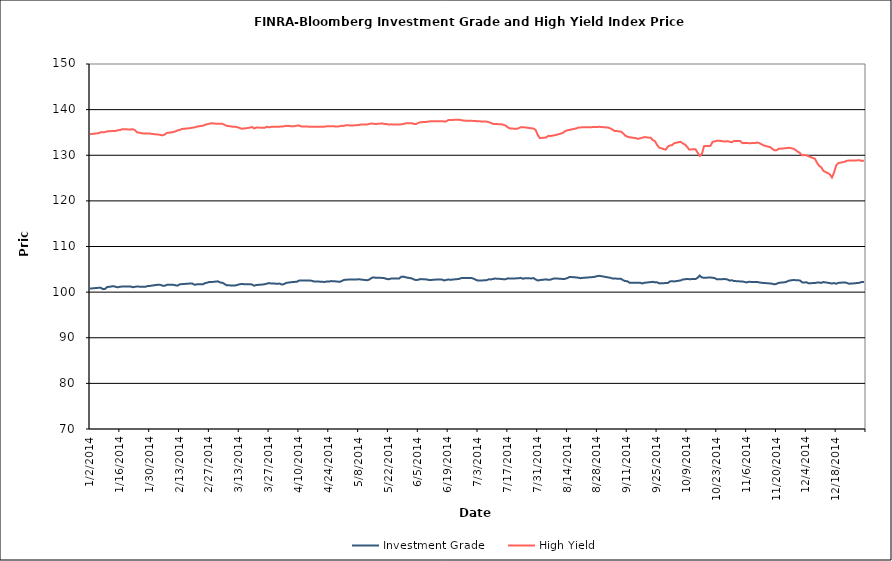
| Category | Investment Grade | High Yield |
|---|---|---|
| 1/2/14 | 100.818 | 134.61 |
| 1/3/14 | 100.821 | 134.675 |
| 1/6/14 | 100.947 | 134.841 |
| 1/7/14 | 100.979 | 135.053 |
| 1/8/14 | 100.662 | 135.04 |
| 1/9/14 | 100.703 | 135.072 |
| 1/10/14 | 101.104 | 135.228 |
| 1/13/14 | 101.302 | 135.332 |
| 1/14/14 | 101.168 | 135.33 |
| 1/15/14 | 101.05 | 135.493 |
| 1/16/14 | 101.186 | 135.513 |
| 1/17/14 | 101.214 | 135.694 |
| 1/21/14 | 101.237 | 135.657 |
| 1/22/14 | 101.077 | 135.696 |
| 1/23/14 | 101.165 | 135.526 |
| 1/24/14 | 101.225 | 135.025 |
| 1/27/14 | 101.165 | 134.766 |
| 1/28/14 | 101.185 | 134.798 |
| 1/29/14 | 101.336 | 134.736 |
| 1/30/14 | 101.366 | 134.782 |
| 1/31/14 | 101.431 | 134.664 |
| 2/3/14 | 101.636 | 134.541 |
| 2/4/14 | 101.583 | 134.457 |
| 2/5/14 | 101.42 | 134.361 |
| 2/6/14 | 101.393 | 134.536 |
| 2/7/14 | 101.592 | 134.888 |
| 2/10/14 | 101.615 | 135.076 |
| 2/11/14 | 101.498 | 135.216 |
| 2/12/14 | 101.418 | 135.441 |
| 2/13/14 | 101.69 | 135.543 |
| 2/14/14 | 101.753 | 135.746 |
| 2/18/14 | 101.892 | 135.952 |
| 2/19/14 | 101.879 | 136.044 |
| 2/20/14 | 101.613 | 136.097 |
| 2/21/14 | 101.699 | 136.258 |
| 2/24/14 | 101.732 | 136.482 |
| 2/25/14 | 101.989 | 136.691 |
| 2/26/14 | 102.079 | 136.809 |
| 2/27/14 | 102.222 | 136.918 |
| 2/28/14 | 102.211 | 137.009 |
| 3/3/14 | 102.364 | 136.884 |
| 3/4/14 | 102.118 | 136.915 |
| 3/5/14 | 102.048 | 136.916 |
| 3/6/14 | 101.816 | 136.684 |
| 3/7/14 | 101.497 | 136.459 |
| 3/10/14 | 101.461 | 136.253 |
| 3/11/14 | 101.46 | 136.252 |
| 3/12/14 | 101.557 | 136.142 |
| 3/13/14 | 101.718 | 136.026 |
| 3/14/14 | 101.769 | 135.809 |
| 3/17/14 | 101.717 | 135.965 |
| 3/18/14 | 101.749 | 136.072 |
| 3/19/14 | 101.649 | 136.191 |
| 3/20/14 | 101.412 | 135.875 |
| 3/21/14 | 101.566 | 136.086 |
| 3/24/14 | 101.667 | 136.015 |
| 3/25/14 | 101.737 | 136.04 |
| 3/26/14 | 101.878 | 136.252 |
| 3/27/14 | 101.987 | 136.119 |
| 3/28/14 | 101.878 | 136.233 |
| 3/31/14 | 101.852 | 136.266 |
| 4/1/14 | 101.868 | 136.261 |
| 4/2/14 | 101.643 | 136.321 |
| 4/3/14 | 101.764 | 136.337 |
| 4/4/14 | 102.025 | 136.448 |
| 4/7/14 | 102.21 | 136.349 |
| 4/8/14 | 102.242 | 136.393 |
| 4/9/14 | 102.266 | 136.486 |
| 4/10/14 | 102.532 | 136.521 |
| 4/11/14 | 102.573 | 136.311 |
| 4/14/14 | 102.531 | 136.308 |
| 4/15/14 | 102.544 | 136.227 |
| 4/16/14 | 102.487 | 136.253 |
| 4/17/14 | 102.346 | 136.257 |
| 4/21/14 | 102.277 | 136.247 |
| 4/22/14 | 102.207 | 136.279 |
| 4/23/14 | 102.343 | 136.332 |
| 4/24/14 | 102.303 | 136.334 |
| 4/25/14 | 102.421 | 136.355 |
| 4/28/14 | 102.328 | 136.308 |
| 4/29/14 | 102.243 | 136.341 |
| 4/30/14 | 102.413 | 136.464 |
| 5/1/14 | 102.654 | 136.42 |
| 5/2/14 | 102.735 | 136.585 |
| 5/5/14 | 102.752 | 136.518 |
| 5/6/14 | 102.75 | 136.554 |
| 5/7/14 | 102.757 | 136.59 |
| 5/8/14 | 102.825 | 136.629 |
| 5/9/14 | 102.765 | 136.738 |
| 5/12/14 | 102.608 | 136.757 |
| 5/13/14 | 102.76 | 136.86 |
| 5/14/14 | 103.095 | 136.951 |
| 5/15/14 | 103.233 | 136.892 |
| 5/16/14 | 103.154 | 136.848 |
| 5/19/14 | 103.118 | 136.968 |
| 5/20/14 | 103.068 | 136.874 |
| 5/21/14 | 102.909 | 136.849 |
| 5/22/14 | 102.817 | 136.739 |
| 5/23/14 | 102.956 | 136.771 |
| 5/27/14 | 102.996 | 136.726 |
| 5/28/14 | 103.368 | 136.78 |
| 5/29/14 | 103.4 | 136.844 |
| 5/30/14 | 103.25 | 136.989 |
| 6/2/14 | 102.997 | 137.03 |
| 6/3/14 | 102.747 | 136.843 |
| 6/4/14 | 102.639 | 136.861 |
| 6/5/14 | 102.724 | 137.095 |
| 6/6/14 | 102.858 | 137.239 |
| 6/9/14 | 102.774 | 137.321 |
| 6/10/14 | 102.652 | 137.409 |
| 6/11/14 | 102.666 | 137.46 |
| 6/12/14 | 102.706 | 137.448 |
| 6/13/14 | 102.744 | 137.427 |
| 6/16/14 | 102.763 | 137.473 |
| 6/17/14 | 102.566 | 137.403 |
| 6/18/14 | 102.647 | 137.424 |
| 6/19/14 | 102.775 | 137.698 |
| 6/20/14 | 102.697 | 137.723 |
| 6/23/14 | 102.846 | 137.779 |
| 6/24/14 | 102.88 | 137.797 |
| 6/25/14 | 103.059 | 137.699 |
| 6/26/14 | 103.117 | 137.613 |
| 6/27/14 | 103.111 | 137.582 |
| 6/30/14 | 103.096 | 137.543 |
| 7/1/14 | 102.92 | 137.521 |
| 7/2/14 | 102.692 | 137.487 |
| 7/3/14 | 102.53 | 137.445 |
| 7/7/14 | 102.607 | 137.369 |
| 7/8/14 | 102.82 | 137.259 |
| 7/9/14 | 102.778 | 137.102 |
| 7/10/14 | 102.892 | 136.873 |
| 7/11/14 | 102.97 | 136.858 |
| 7/14/14 | 102.883 | 136.783 |
| 7/15/14 | 102.808 | 136.662 |
| 7/16/14 | 102.837 | 136.489 |
| 7/17/14 | 103.023 | 136.093 |
| 7/18/14 | 102.976 | 135.884 |
| 7/21/14 | 103.018 | 135.786 |
| 7/22/14 | 103.027 | 135.911 |
| 7/23/14 | 103.133 | 136.146 |
| 7/24/14 | 102.926 | 136.135 |
| 7/25/14 | 103.053 | 136.103 |
| 7/28/14 | 103.005 | 135.916 |
| 7/29/14 | 103.084 | 135.842 |
| 7/30/14 | 102.775 | 135.555 |
| 7/31/14 | 102.536 | 134.442 |
| 8/1/14 | 102.65 | 133.751 |
| 8/4/14 | 102.794 | 133.906 |
| 8/5/14 | 102.693 | 134.262 |
| 8/6/14 | 102.743 | 134.202 |
| 8/7/14 | 102.903 | 134.308 |
| 8/8/14 | 103.015 | 134.39 |
| 8/11/14 | 102.911 | 134.76 |
| 8/12/14 | 102.848 | 134.962 |
| 8/13/14 | 102.947 | 135.352 |
| 8/14/14 | 103.093 | 135.465 |
| 8/15/14 | 103.336 | 135.579 |
| 8/18/14 | 103.224 | 135.868 |
| 8/19/14 | 103.166 | 136.06 |
| 8/20/14 | 103.049 | 136.102 |
| 8/21/14 | 103.116 | 136.129 |
| 8/22/14 | 103.16 | 136.109 |
| 8/25/14 | 103.266 | 136.118 |
| 8/26/14 | 103.305 | 136.212 |
| 8/27/14 | 103.386 | 136.164 |
| 8/28/14 | 103.533 | 136.214 |
| 8/29/14 | 103.569 | 136.23 |
| 9/2/14 | 103.224 | 136.057 |
| 9/3/14 | 103.152 | 135.89 |
| 9/4/14 | 102.992 | 135.641 |
| 9/5/14 | 102.979 | 135.338 |
| 9/8/14 | 102.91 | 135.188 |
| 9/9/14 | 102.636 | 134.826 |
| 9/10/14 | 102.415 | 134.318 |
| 9/11/14 | 102.404 | 134.077 |
| 9/12/14 | 102.066 | 133.947 |
| 9/15/14 | 102.058 | 133.746 |
| 9/16/14 | 102.079 | 133.58 |
| 9/17/14 | 102.06 | 133.729 |
| 9/18/14 | 101.895 | 133.842 |
| 9/19/14 | 102.051 | 133.984 |
| 9/22/14 | 102.194 | 133.817 |
| 9/23/14 | 102.265 | 133.321 |
| 9/24/14 | 102.135 | 133.064 |
| 9/25/14 | 102.162 | 132.238 |
| 9/26/14 | 101.911 | 131.656 |
| 9/29/14 | 101.987 | 131.223 |
| 9/30/14 | 101.995 | 131.89 |
| 10/1/14 | 102.349 | 132.149 |
| 10/2/14 | 102.373 | 132.201 |
| 10/3/14 | 102.345 | 132.64 |
| 10/6/14 | 102.56 | 132.946 |
| 10/7/14 | 102.76 | 132.603 |
| 10/8/14 | 102.816 | 132.383 |
| 10/9/14 | 102.873 | 131.878 |
| 10/10/14 | 102.843 | 131.266 |
| 10/13/14 | 102.861 | 131.314 |
| 10/14/14 | 103.153 | 130.54 |
| 10/15/14 | 103.63 | 129.86 |
| 10/16/14 | 103.21 | 130.301 |
| 10/17/14 | 103.149 | 132.001 |
| 10/20/14 | 103.206 | 132.057 |
| 10/21/14 | 103.156 | 132.922 |
| 10/22/14 | 103.063 | 133.044 |
| 10/23/14 | 102.823 | 133.165 |
| 10/24/14 | 102.843 | 133.183 |
| 10/27/14 | 102.852 | 132.995 |
| 10/28/14 | 102.764 | 133.102 |
| 10/29/14 | 102.545 | 132.948 |
| 10/30/14 | 102.596 | 132.859 |
| 10/31/14 | 102.445 | 133.107 |
| 11/3/14 | 102.344 | 133.133 |
| 11/4/14 | 102.35 | 132.642 |
| 11/5/14 | 102.221 | 132.701 |
| 11/6/14 | 102.127 | 132.705 |
| 11/7/14 | 102.255 | 132.638 |
| 11/10/14 | 102.218 | 132.691 |
| 11/11/14 | 102.225 | 132.81 |
| 11/12/14 | 102.112 | 132.619 |
| 11/13/14 | 102.052 | 132.412 |
| 11/14/14 | 102.008 | 132.145 |
| 11/17/14 | 101.894 | 131.772 |
| 11/18/14 | 101.843 | 131.427 |
| 11/19/14 | 101.695 | 131.083 |
| 11/20/14 | 101.809 | 131.09 |
| 11/21/14 | 102.03 | 131.414 |
| 11/24/14 | 102.171 | 131.531 |
| 11/25/14 | 102.338 | 131.588 |
| 11/26/14 | 102.539 | 131.644 |
| 11/28/14 | 102.655 | 131.425 |
| 12/1/14 | 102.559 | 130.466 |
| 12/2/14 | 102.141 | 129.983 |
| 12/3/14 | 102.081 | 130.038 |
| 12/4/14 | 102.177 | 129.993 |
| 12/5/14 | 101.947 | 129.782 |
| 12/8/14 | 101.994 | 129.233 |
| 12/9/14 | 102.101 | 128.353 |
| 12/10/14 | 102.099 | 127.663 |
| 12/11/14 | 102.021 | 127.356 |
| 12/12/14 | 102.212 | 126.57 |
| 12/15/14 | 101.978 | 125.84 |
| 12/16/14 | 101.885 | 125.12 |
| 12/17/14 | 101.994 | 126.235 |
| 12/18/14 | 101.843 | 127.8 |
| 12/19/14 | 102.027 | 128.272 |
| 12/22/14 | 102.137 | 128.584 |
| 12/23/14 | 102.011 | 128.794 |
| 12/24/14 | 101.848 | 128.833 |
| 12/26/14 | 101.905 | 128.825 |
| 12/29/14 | 102.054 | 128.921 |
| 12/30/14 | 102.239 | 128.765 |
| 12/31/14 | 102.233 | 128.769 |